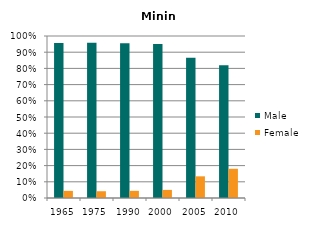
| Category | Male | Female |
|---|---|---|
| 1965.0 | 0.956 | 0.044 |
| 1975.0 | 0.958 | 0.042 |
| 1990.0 | 0.956 | 0.044 |
| 2000.0 | 0.95 | 0.05 |
| 2005.0 | 0.866 | 0.134 |
| 2010.0 | 0.82 | 0.18 |